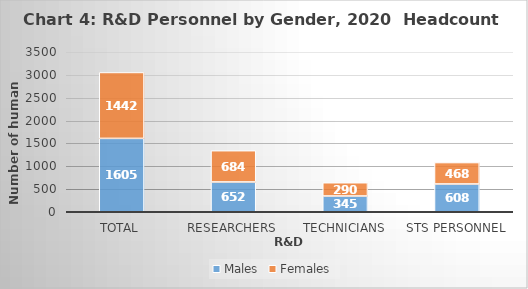
| Category | Males | Females |
|---|---|---|
| Total | 1605 | 1442 |
| Researchers | 652 | 684 |
| Technicians | 345 | 290 |
| STS Personnel | 608 | 468 |